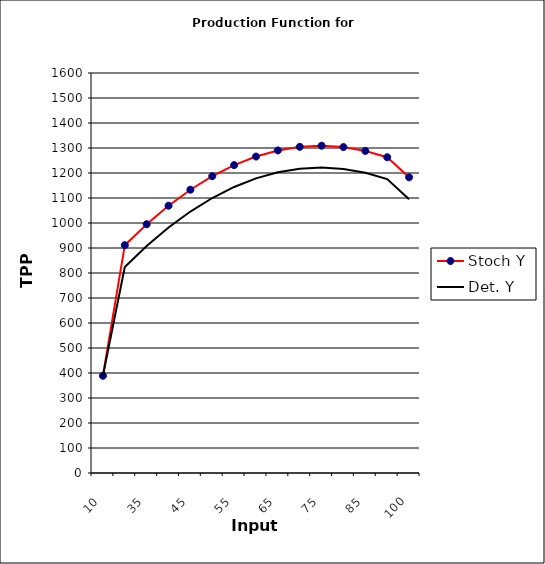
| Category | Stoch Y | Det. Y |
|---|---|---|
| 10.0 | 388.966 | 388.966 |
| 30.0 | 911.198 | 823.88 |
| 35.0 | 995.112 | 907.794 |
| 40.0 | 1069.1 | 981.782 |
| 45.0 | 1133.162 | 1045.845 |
| 50.0 | 1187.299 | 1099.981 |
| 55.0 | 1231.509 | 1144.192 |
| 60.0 | 1265.794 | 1178.477 |
| 65.0 | 1290.153 | 1202.836 |
| 70.0 | 1304.586 | 1217.269 |
| 75.0 | 1309.093 | 1221.776 |
| 80.0 | 1303.675 | 1216.357 |
| 85.0 | 1288.33 | 1201.013 |
| 90.0 | 1263.06 | 1175.742 |
| 100.0 | 1182.742 | 1095.424 |